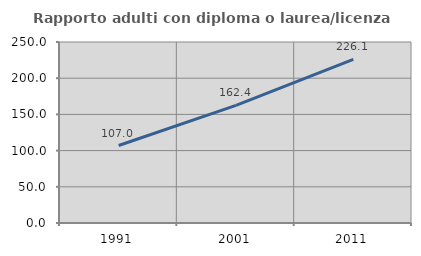
| Category | Rapporto adulti con diploma o laurea/licenza media  |
|---|---|
| 1991.0 | 107.002 |
| 2001.0 | 162.438 |
| 2011.0 | 226.073 |